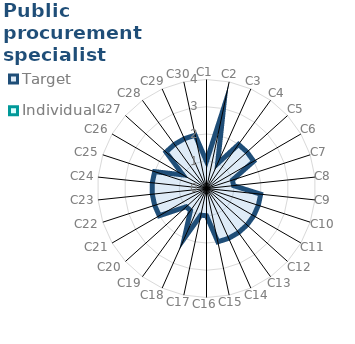
| Category | Target | Individual 4 |
|---|---|---|
| C1 | 1 | 0 |
| C2 | 3 | 0 |
| C3 | 1 | 0 |
| C4 | 2 | 0 |
| C5 | 2 | 0 |
| C6 | 2 | 0 |
| C7 | 1 | 0 |
| C8 | 1 | 0 |
| C9 | 2 | 0 |
| C10 | 2 | 0 |
| C11 | 2 | 0 |
| C12 | 2 | 0 |
| C13 | 2 | 0 |
| C14 | 2 | 0 |
| C15 | 2 | 0 |
| C16 | 1 | 0 |
| C17 | 1 | 0 |
| C18 | 2 | 0 |
| C19 | 1 | 0 |
| C20 | 1 | 0 |
| C21 | 2 | 0 |
| C22 | 2 | 0 |
| C23 | 2 | 0 |
| C24 | 2 | 0 |
| C25 | 2 | 0 |
| C26 | 1 | 0 |
| C27 | 2 | 0 |
| C28 | 2 | 0 |
| C29 | 2 | 0 |
| C30 | 2 | 0 |